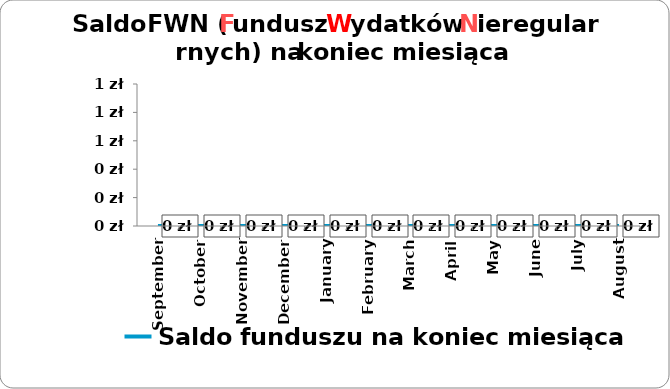
| Category | Saldo funduszu na koniec miesiąca |
|---|---|
| 2023-09-01 | 0 |
| 2023-10-01 | 0 |
| 2023-11-01 | 0 |
| 2023-12-01 | 0 |
| 2024-01-01 | 0 |
| 2024-02-01 | 0 |
| 2024-03-01 | 0 |
| 2024-04-01 | 0 |
| 2024-05-01 | 0 |
| 2024-06-01 | 0 |
| 2024-07-01 | 0 |
| 2024-08-01 | 0 |